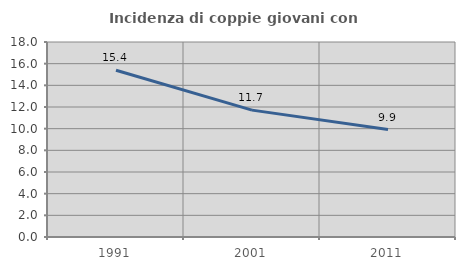
| Category | Incidenza di coppie giovani con figli |
|---|---|
| 1991.0 | 15.391 |
| 2001.0 | 11.71 |
| 2011.0 | 9.913 |